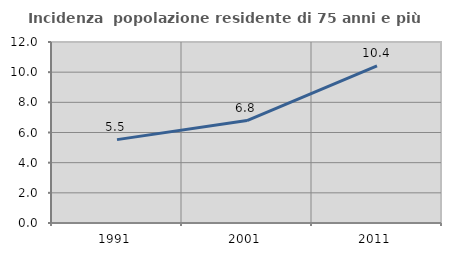
| Category | Incidenza  popolazione residente di 75 anni e più |
|---|---|
| 1991.0 | 5.528 |
| 2001.0 | 6.792 |
| 2011.0 | 10.421 |